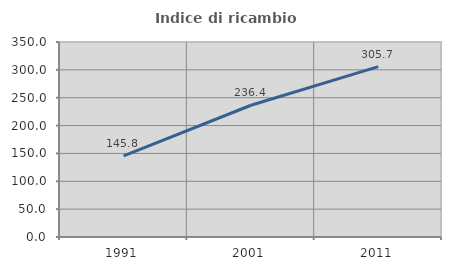
| Category | Indice di ricambio occupazionale  |
|---|---|
| 1991.0 | 145.783 |
| 2001.0 | 236.444 |
| 2011.0 | 305.691 |